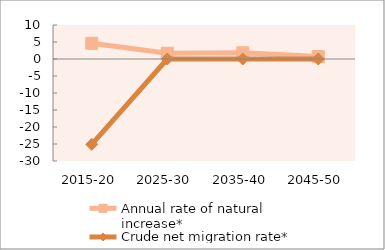
| Category | Annual rate of natural increase* | Crude net migration rate* |
|---|---|---|
| 2015-20 | 4.624 | -25.103 |
| 2025-30 | 1.684 | 0 |
| 2035-40 | 1.833 | 0 |
| 2045-50 | 0.724 | 0 |